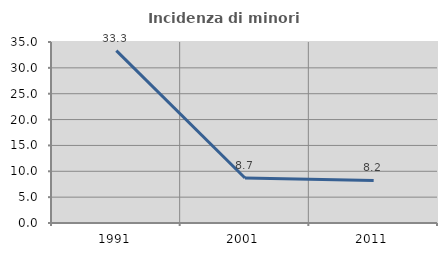
| Category | Incidenza di minori stranieri |
|---|---|
| 1991.0 | 33.333 |
| 2001.0 | 8.696 |
| 2011.0 | 8.235 |